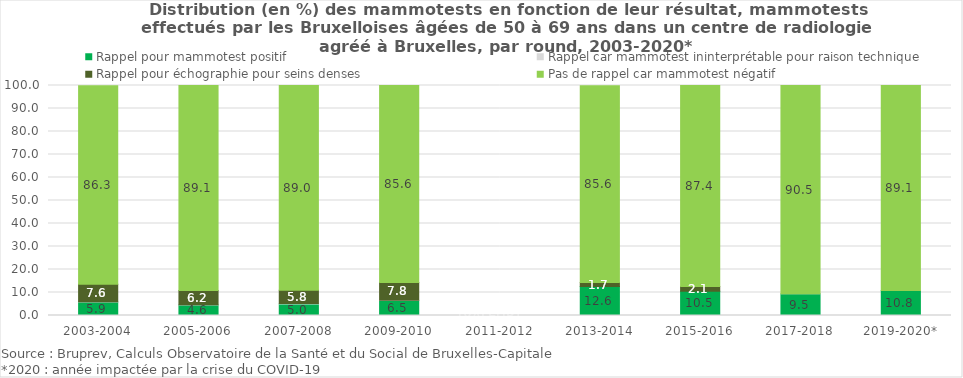
| Category | Rappel pour mammotest positif  | Rappel car mammotest ininterprétable pour raison technique  | Rappel pour échographie pour seins denses  | Pas de rappel car mammotest négatif |
|---|---|---|---|---|
| 2003-2004 | 5.9 | 0.1 | 7.6 | 86.3 |
| 2005-2006 | 4.6 | 0.1 | 6.2 | 89.1 |
| 2007-2008 | 5 | 0.2 | 5.8 | 89 |
| 2009-2010 | 6.5 | 0.1 | 7.8 | 85.6 |
| 2011-2012 | 0 | 0 | 0 | 0 |
| 2013-2014 | 12.6 | 0 | 1.7 | 85.618 |
| 2015-2016 | 10.5 | 0 | 2.1 | 87.374 |
| 2017-2018 | 9.478 | 0.025 | 0 | 90.498 |
| 2019-2020* | 10.846 | 0.048 | 0 | 89.106 |